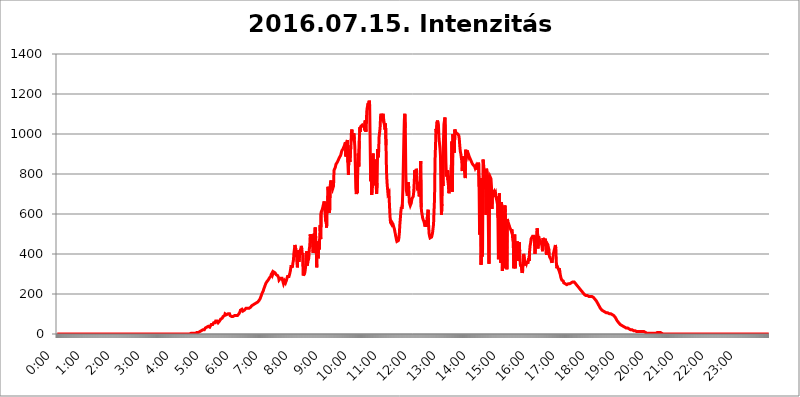
| Category | 2016.07.15. Intenzitás [W/m^2] |
|---|---|
| 0.0 | 0 |
| 0.0006944444444444445 | 0 |
| 0.001388888888888889 | 0 |
| 0.0020833333333333333 | 0 |
| 0.002777777777777778 | 0 |
| 0.003472222222222222 | 0 |
| 0.004166666666666667 | 0 |
| 0.004861111111111111 | 0 |
| 0.005555555555555556 | 0 |
| 0.0062499999999999995 | 0 |
| 0.006944444444444444 | 0 |
| 0.007638888888888889 | 0 |
| 0.008333333333333333 | 0 |
| 0.009027777777777779 | 0 |
| 0.009722222222222222 | 0 |
| 0.010416666666666666 | 0 |
| 0.011111111111111112 | 0 |
| 0.011805555555555555 | 0 |
| 0.012499999999999999 | 0 |
| 0.013194444444444444 | 0 |
| 0.013888888888888888 | 0 |
| 0.014583333333333332 | 0 |
| 0.015277777777777777 | 0 |
| 0.015972222222222224 | 0 |
| 0.016666666666666666 | 0 |
| 0.017361111111111112 | 0 |
| 0.018055555555555557 | 0 |
| 0.01875 | 0 |
| 0.019444444444444445 | 0 |
| 0.02013888888888889 | 0 |
| 0.020833333333333332 | 0 |
| 0.02152777777777778 | 0 |
| 0.022222222222222223 | 0 |
| 0.02291666666666667 | 0 |
| 0.02361111111111111 | 0 |
| 0.024305555555555556 | 0 |
| 0.024999999999999998 | 0 |
| 0.025694444444444447 | 0 |
| 0.02638888888888889 | 0 |
| 0.027083333333333334 | 0 |
| 0.027777777777777776 | 0 |
| 0.02847222222222222 | 0 |
| 0.029166666666666664 | 0 |
| 0.029861111111111113 | 0 |
| 0.030555555555555555 | 0 |
| 0.03125 | 0 |
| 0.03194444444444445 | 0 |
| 0.03263888888888889 | 0 |
| 0.03333333333333333 | 0 |
| 0.034027777777777775 | 0 |
| 0.034722222222222224 | 0 |
| 0.035416666666666666 | 0 |
| 0.036111111111111115 | 0 |
| 0.03680555555555556 | 0 |
| 0.0375 | 0 |
| 0.03819444444444444 | 0 |
| 0.03888888888888889 | 0 |
| 0.03958333333333333 | 0 |
| 0.04027777777777778 | 0 |
| 0.04097222222222222 | 0 |
| 0.041666666666666664 | 0 |
| 0.042361111111111106 | 0 |
| 0.04305555555555556 | 0 |
| 0.043750000000000004 | 0 |
| 0.044444444444444446 | 0 |
| 0.04513888888888889 | 0 |
| 0.04583333333333334 | 0 |
| 0.04652777777777778 | 0 |
| 0.04722222222222222 | 0 |
| 0.04791666666666666 | 0 |
| 0.04861111111111111 | 0 |
| 0.049305555555555554 | 0 |
| 0.049999999999999996 | 0 |
| 0.05069444444444445 | 0 |
| 0.051388888888888894 | 0 |
| 0.052083333333333336 | 0 |
| 0.05277777777777778 | 0 |
| 0.05347222222222222 | 0 |
| 0.05416666666666667 | 0 |
| 0.05486111111111111 | 0 |
| 0.05555555555555555 | 0 |
| 0.05625 | 0 |
| 0.05694444444444444 | 0 |
| 0.057638888888888885 | 0 |
| 0.05833333333333333 | 0 |
| 0.05902777777777778 | 0 |
| 0.059722222222222225 | 0 |
| 0.06041666666666667 | 0 |
| 0.061111111111111116 | 0 |
| 0.06180555555555556 | 0 |
| 0.0625 | 0 |
| 0.06319444444444444 | 0 |
| 0.06388888888888888 | 0 |
| 0.06458333333333334 | 0 |
| 0.06527777777777778 | 0 |
| 0.06597222222222222 | 0 |
| 0.06666666666666667 | 0 |
| 0.06736111111111111 | 0 |
| 0.06805555555555555 | 0 |
| 0.06874999999999999 | 0 |
| 0.06944444444444443 | 0 |
| 0.07013888888888889 | 0 |
| 0.07083333333333333 | 0 |
| 0.07152777777777779 | 0 |
| 0.07222222222222223 | 0 |
| 0.07291666666666667 | 0 |
| 0.07361111111111111 | 0 |
| 0.07430555555555556 | 0 |
| 0.075 | 0 |
| 0.07569444444444444 | 0 |
| 0.0763888888888889 | 0 |
| 0.07708333333333334 | 0 |
| 0.07777777777777778 | 0 |
| 0.07847222222222222 | 0 |
| 0.07916666666666666 | 0 |
| 0.0798611111111111 | 0 |
| 0.08055555555555556 | 0 |
| 0.08125 | 0 |
| 0.08194444444444444 | 0 |
| 0.08263888888888889 | 0 |
| 0.08333333333333333 | 0 |
| 0.08402777777777777 | 0 |
| 0.08472222222222221 | 0 |
| 0.08541666666666665 | 0 |
| 0.08611111111111112 | 0 |
| 0.08680555555555557 | 0 |
| 0.08750000000000001 | 0 |
| 0.08819444444444445 | 0 |
| 0.08888888888888889 | 0 |
| 0.08958333333333333 | 0 |
| 0.09027777777777778 | 0 |
| 0.09097222222222222 | 0 |
| 0.09166666666666667 | 0 |
| 0.09236111111111112 | 0 |
| 0.09305555555555556 | 0 |
| 0.09375 | 0 |
| 0.09444444444444444 | 0 |
| 0.09513888888888888 | 0 |
| 0.09583333333333333 | 0 |
| 0.09652777777777777 | 0 |
| 0.09722222222222222 | 0 |
| 0.09791666666666667 | 0 |
| 0.09861111111111111 | 0 |
| 0.09930555555555555 | 0 |
| 0.09999999999999999 | 0 |
| 0.10069444444444443 | 0 |
| 0.1013888888888889 | 0 |
| 0.10208333333333335 | 0 |
| 0.10277777777777779 | 0 |
| 0.10347222222222223 | 0 |
| 0.10416666666666667 | 0 |
| 0.10486111111111111 | 0 |
| 0.10555555555555556 | 0 |
| 0.10625 | 0 |
| 0.10694444444444444 | 0 |
| 0.1076388888888889 | 0 |
| 0.10833333333333334 | 0 |
| 0.10902777777777778 | 0 |
| 0.10972222222222222 | 0 |
| 0.1111111111111111 | 0 |
| 0.11180555555555556 | 0 |
| 0.11180555555555556 | 0 |
| 0.1125 | 0 |
| 0.11319444444444444 | 0 |
| 0.11388888888888889 | 0 |
| 0.11458333333333333 | 0 |
| 0.11527777777777777 | 0 |
| 0.11597222222222221 | 0 |
| 0.11666666666666665 | 0 |
| 0.1173611111111111 | 0 |
| 0.11805555555555557 | 0 |
| 0.11944444444444445 | 0 |
| 0.12013888888888889 | 0 |
| 0.12083333333333333 | 0 |
| 0.12152777777777778 | 0 |
| 0.12222222222222223 | 0 |
| 0.12291666666666667 | 0 |
| 0.12291666666666667 | 0 |
| 0.12361111111111112 | 0 |
| 0.12430555555555556 | 0 |
| 0.125 | 0 |
| 0.12569444444444444 | 0 |
| 0.12638888888888888 | 0 |
| 0.12708333333333333 | 0 |
| 0.16875 | 0 |
| 0.12847222222222224 | 0 |
| 0.12916666666666668 | 0 |
| 0.12986111111111112 | 0 |
| 0.13055555555555556 | 0 |
| 0.13125 | 0 |
| 0.13194444444444445 | 0 |
| 0.1326388888888889 | 0 |
| 0.13333333333333333 | 0 |
| 0.13402777777777777 | 0 |
| 0.13402777777777777 | 0 |
| 0.13472222222222222 | 0 |
| 0.13541666666666666 | 0 |
| 0.1361111111111111 | 0 |
| 0.13749999999999998 | 0 |
| 0.13819444444444443 | 0 |
| 0.1388888888888889 | 0 |
| 0.13958333333333334 | 0 |
| 0.14027777777777778 | 0 |
| 0.14097222222222222 | 0 |
| 0.14166666666666666 | 0 |
| 0.1423611111111111 | 0 |
| 0.14305555555555557 | 0 |
| 0.14375000000000002 | 0 |
| 0.14444444444444446 | 0 |
| 0.1451388888888889 | 0 |
| 0.1451388888888889 | 0 |
| 0.14652777777777778 | 0 |
| 0.14722222222222223 | 0 |
| 0.14791666666666667 | 0 |
| 0.1486111111111111 | 0 |
| 0.14930555555555555 | 0 |
| 0.15 | 0 |
| 0.15069444444444444 | 0 |
| 0.15138888888888888 | 0 |
| 0.15208333333333332 | 0 |
| 0.15277777777777776 | 0 |
| 0.15347222222222223 | 0 |
| 0.15416666666666667 | 0 |
| 0.15486111111111112 | 0 |
| 0.15555555555555556 | 0 |
| 0.15625 | 0 |
| 0.15694444444444444 | 0 |
| 0.15763888888888888 | 0 |
| 0.15833333333333333 | 0 |
| 0.15902777777777777 | 0 |
| 0.15972222222222224 | 0 |
| 0.16041666666666668 | 0 |
| 0.16111111111111112 | 0 |
| 0.16180555555555556 | 0 |
| 0.1625 | 0 |
| 0.16319444444444445 | 0 |
| 0.1638888888888889 | 0 |
| 0.16458333333333333 | 0 |
| 0.16527777777777777 | 0 |
| 0.16597222222222222 | 0 |
| 0.16666666666666666 | 0 |
| 0.1673611111111111 | 0 |
| 0.16805555555555554 | 0 |
| 0.16874999999999998 | 0 |
| 0.16944444444444443 | 0 |
| 0.17013888888888887 | 0 |
| 0.1708333333333333 | 0 |
| 0.17152777777777775 | 0 |
| 0.17222222222222225 | 0 |
| 0.1729166666666667 | 0 |
| 0.17361111111111113 | 0 |
| 0.17430555555555557 | 0 |
| 0.17500000000000002 | 0 |
| 0.17569444444444446 | 0 |
| 0.1763888888888889 | 0 |
| 0.17708333333333334 | 0 |
| 0.17777777777777778 | 0 |
| 0.17847222222222223 | 0 |
| 0.17916666666666667 | 0 |
| 0.1798611111111111 | 0 |
| 0.18055555555555555 | 0 |
| 0.18125 | 0 |
| 0.18194444444444444 | 0 |
| 0.1826388888888889 | 0 |
| 0.18333333333333335 | 0 |
| 0.1840277777777778 | 0 |
| 0.18472222222222223 | 0 |
| 0.18541666666666667 | 0 |
| 0.18611111111111112 | 0 |
| 0.18680555555555556 | 3.525 |
| 0.1875 | 3.525 |
| 0.18819444444444444 | 3.525 |
| 0.18888888888888888 | 3.525 |
| 0.18958333333333333 | 3.525 |
| 0.19027777777777777 | 3.525 |
| 0.1909722222222222 | 3.525 |
| 0.19166666666666665 | 3.525 |
| 0.19236111111111112 | 7.887 |
| 0.19305555555555554 | 3.525 |
| 0.19375 | 3.525 |
| 0.19444444444444445 | 3.525 |
| 0.1951388888888889 | 7.887 |
| 0.19583333333333333 | 7.887 |
| 0.19652777777777777 | 7.887 |
| 0.19722222222222222 | 7.887 |
| 0.19791666666666666 | 7.887 |
| 0.1986111111111111 | 12.257 |
| 0.19930555555555554 | 12.257 |
| 0.19999999999999998 | 12.257 |
| 0.20069444444444443 | 12.257 |
| 0.20138888888888887 | 16.636 |
| 0.2020833333333333 | 16.636 |
| 0.2027777777777778 | 16.636 |
| 0.2034722222222222 | 21.024 |
| 0.2041666666666667 | 21.024 |
| 0.20486111111111113 | 21.024 |
| 0.20555555555555557 | 21.024 |
| 0.20625000000000002 | 21.024 |
| 0.20694444444444446 | 25.419 |
| 0.2076388888888889 | 29.823 |
| 0.20833333333333334 | 29.823 |
| 0.20902777777777778 | 29.823 |
| 0.20972222222222223 | 34.234 |
| 0.21041666666666667 | 34.234 |
| 0.2111111111111111 | 34.234 |
| 0.21180555555555555 | 38.653 |
| 0.2125 | 38.653 |
| 0.21319444444444444 | 34.234 |
| 0.2138888888888889 | 34.234 |
| 0.21458333333333335 | 38.653 |
| 0.2152777777777778 | 38.653 |
| 0.21597222222222223 | 47.511 |
| 0.21666666666666667 | 47.511 |
| 0.21736111111111112 | 47.511 |
| 0.21805555555555556 | 47.511 |
| 0.21875 | 51.951 |
| 0.21944444444444444 | 56.398 |
| 0.22013888888888888 | 56.398 |
| 0.22083333333333333 | 60.85 |
| 0.22152777777777777 | 56.398 |
| 0.2222222222222222 | 65.31 |
| 0.22291666666666665 | 65.31 |
| 0.2236111111111111 | 65.31 |
| 0.22430555555555556 | 65.31 |
| 0.225 | 60.85 |
| 0.22569444444444445 | 56.398 |
| 0.2263888888888889 | 60.85 |
| 0.22708333333333333 | 60.85 |
| 0.22777777777777777 | 65.31 |
| 0.22847222222222222 | 65.31 |
| 0.22916666666666666 | 74.246 |
| 0.2298611111111111 | 74.246 |
| 0.23055555555555554 | 74.246 |
| 0.23124999999999998 | 78.722 |
| 0.23194444444444443 | 83.205 |
| 0.23263888888888887 | 87.692 |
| 0.2333333333333333 | 87.692 |
| 0.2340277777777778 | 92.184 |
| 0.2347222222222222 | 92.184 |
| 0.2354166666666667 | 101.184 |
| 0.23611111111111113 | 96.682 |
| 0.23680555555555557 | 96.682 |
| 0.23750000000000002 | 96.682 |
| 0.23819444444444446 | 96.682 |
| 0.2388888888888889 | 96.682 |
| 0.23958333333333334 | 101.184 |
| 0.24027777777777778 | 105.69 |
| 0.24097222222222223 | 101.184 |
| 0.24166666666666667 | 101.184 |
| 0.2423611111111111 | 92.184 |
| 0.24305555555555555 | 87.692 |
| 0.24375 | 87.692 |
| 0.24444444444444446 | 87.692 |
| 0.24513888888888888 | 87.692 |
| 0.24583333333333335 | 87.692 |
| 0.2465277777777778 | 87.692 |
| 0.24722222222222223 | 87.692 |
| 0.24791666666666667 | 87.692 |
| 0.24861111111111112 | 92.184 |
| 0.24930555555555556 | 92.184 |
| 0.25 | 92.184 |
| 0.25069444444444444 | 92.184 |
| 0.2513888888888889 | 92.184 |
| 0.2520833333333333 | 92.184 |
| 0.25277777777777777 | 92.184 |
| 0.2534722222222222 | 92.184 |
| 0.25416666666666665 | 92.184 |
| 0.2548611111111111 | 101.184 |
| 0.2555555555555556 | 105.69 |
| 0.25625000000000003 | 110.201 |
| 0.2569444444444445 | 119.235 |
| 0.2576388888888889 | 119.235 |
| 0.25833333333333336 | 119.235 |
| 0.2590277777777778 | 123.758 |
| 0.25972222222222224 | 119.235 |
| 0.2604166666666667 | 114.716 |
| 0.2611111111111111 | 114.716 |
| 0.26180555555555557 | 119.235 |
| 0.2625 | 119.235 |
| 0.26319444444444445 | 119.235 |
| 0.2638888888888889 | 123.758 |
| 0.26458333333333334 | 128.284 |
| 0.2652777777777778 | 128.284 |
| 0.2659722222222222 | 128.284 |
| 0.26666666666666666 | 128.284 |
| 0.2673611111111111 | 128.284 |
| 0.26805555555555555 | 128.284 |
| 0.26875 | 128.284 |
| 0.26944444444444443 | 128.284 |
| 0.2701388888888889 | 128.284 |
| 0.2708333333333333 | 132.814 |
| 0.27152777777777776 | 137.347 |
| 0.2722222222222222 | 137.347 |
| 0.27291666666666664 | 141.884 |
| 0.2736111111111111 | 146.423 |
| 0.2743055555555555 | 146.423 |
| 0.27499999999999997 | 146.423 |
| 0.27569444444444446 | 150.964 |
| 0.27638888888888885 | 150.964 |
| 0.27708333333333335 | 150.964 |
| 0.2777777777777778 | 150.964 |
| 0.27847222222222223 | 155.509 |
| 0.2791666666666667 | 155.509 |
| 0.2798611111111111 | 155.509 |
| 0.28055555555555556 | 155.509 |
| 0.28125 | 160.056 |
| 0.28194444444444444 | 164.605 |
| 0.2826388888888889 | 164.605 |
| 0.2833333333333333 | 169.156 |
| 0.28402777777777777 | 173.709 |
| 0.2847222222222222 | 178.264 |
| 0.28541666666666665 | 182.82 |
| 0.28611111111111115 | 191.937 |
| 0.28680555555555554 | 196.497 |
| 0.28750000000000003 | 205.62 |
| 0.2881944444444445 | 210.182 |
| 0.2888888888888889 | 214.746 |
| 0.28958333333333336 | 223.873 |
| 0.2902777777777778 | 228.436 |
| 0.29097222222222224 | 237.564 |
| 0.2916666666666667 | 242.127 |
| 0.2923611111111111 | 251.251 |
| 0.29305555555555557 | 255.813 |
| 0.29375 | 260.373 |
| 0.29444444444444445 | 260.373 |
| 0.2951388888888889 | 264.932 |
| 0.29583333333333334 | 269.49 |
| 0.2965277777777778 | 274.047 |
| 0.2972222222222222 | 278.603 |
| 0.29791666666666666 | 278.603 |
| 0.2986111111111111 | 283.156 |
| 0.29930555555555555 | 287.709 |
| 0.3 | 296.808 |
| 0.30069444444444443 | 301.354 |
| 0.3013888888888889 | 305.898 |
| 0.3020833333333333 | 296.808 |
| 0.30277777777777776 | 301.354 |
| 0.3034722222222222 | 310.44 |
| 0.30416666666666664 | 310.44 |
| 0.3048611111111111 | 310.44 |
| 0.3055555555555555 | 305.898 |
| 0.30624999999999997 | 305.898 |
| 0.3069444444444444 | 296.808 |
| 0.3076388888888889 | 296.808 |
| 0.30833333333333335 | 292.259 |
| 0.3090277777777778 | 292.259 |
| 0.30972222222222223 | 287.709 |
| 0.3104166666666667 | 283.156 |
| 0.3111111111111111 | 269.49 |
| 0.31180555555555556 | 269.49 |
| 0.3125 | 269.49 |
| 0.31319444444444444 | 278.603 |
| 0.3138888888888889 | 283.156 |
| 0.3145833333333333 | 283.156 |
| 0.31527777777777777 | 278.603 |
| 0.3159722222222222 | 274.047 |
| 0.31666666666666665 | 260.373 |
| 0.31736111111111115 | 251.251 |
| 0.31805555555555554 | 251.251 |
| 0.31875000000000003 | 264.932 |
| 0.3194444444444445 | 260.373 |
| 0.3201388888888889 | 255.813 |
| 0.32083333333333336 | 260.373 |
| 0.3215277777777778 | 269.49 |
| 0.32222222222222224 | 278.603 |
| 0.3229166666666667 | 287.709 |
| 0.3236111111111111 | 292.259 |
| 0.32430555555555557 | 283.156 |
| 0.325 | 287.709 |
| 0.32569444444444445 | 296.808 |
| 0.3263888888888889 | 305.898 |
| 0.32708333333333334 | 319.517 |
| 0.3277777777777778 | 337.639 |
| 0.3284722222222222 | 333.113 |
| 0.32916666666666666 | 342.162 |
| 0.3298611111111111 | 337.639 |
| 0.33055555555555555 | 355.712 |
| 0.33125 | 369.23 |
| 0.33194444444444443 | 405.108 |
| 0.3326388888888889 | 422.943 |
| 0.3333333333333333 | 445.129 |
| 0.3340277777777778 | 449.551 |
| 0.3347222222222222 | 422.943 |
| 0.3354166666666667 | 405.108 |
| 0.3361111111111111 | 360.221 |
| 0.3368055555555556 | 333.113 |
| 0.33749999999999997 | 418.492 |
| 0.33819444444444446 | 409.574 |
| 0.33888888888888885 | 360.221 |
| 0.33958333333333335 | 378.224 |
| 0.34027777777777773 | 414.035 |
| 0.34097222222222223 | 418.492 |
| 0.3416666666666666 | 427.39 |
| 0.3423611111111111 | 440.702 |
| 0.3430555555555555 | 422.943 |
| 0.34375 | 396.164 |
| 0.3444444444444445 | 405.108 |
| 0.3451388888888889 | 292.259 |
| 0.3458333333333334 | 292.259 |
| 0.34652777777777777 | 296.808 |
| 0.34722222222222227 | 305.898 |
| 0.34791666666666665 | 324.052 |
| 0.34861111111111115 | 346.682 |
| 0.34930555555555554 | 373.729 |
| 0.35000000000000003 | 414.035 |
| 0.3506944444444444 | 342.162 |
| 0.3513888888888889 | 360.221 |
| 0.3520833333333333 | 360.221 |
| 0.3527777777777778 | 378.224 |
| 0.3534722222222222 | 422.943 |
| 0.3541666666666667 | 440.702 |
| 0.3548611111111111 | 497.836 |
| 0.35555555555555557 | 467.187 |
| 0.35625 | 497.836 |
| 0.35694444444444445 | 475.972 |
| 0.3576388888888889 | 484.735 |
| 0.35833333333333334 | 480.356 |
| 0.3590277777777778 | 405.108 |
| 0.3597222222222222 | 453.968 |
| 0.36041666666666666 | 502.192 |
| 0.3611111111111111 | 440.702 |
| 0.36180555555555555 | 532.513 |
| 0.3625 | 480.356 |
| 0.36319444444444443 | 436.27 |
| 0.3638888888888889 | 333.113 |
| 0.3645833333333333 | 462.786 |
| 0.3652777777777778 | 431.833 |
| 0.3659722222222222 | 378.224 |
| 0.3666666666666667 | 445.129 |
| 0.3673611111111111 | 422.943 |
| 0.3680555555555556 | 475.972 |
| 0.36874999999999997 | 545.416 |
| 0.36944444444444446 | 475.972 |
| 0.37013888888888885 | 609.062 |
| 0.37083333333333335 | 613.252 |
| 0.37152777777777773 | 621.613 |
| 0.37222222222222223 | 629.948 |
| 0.3729166666666666 | 642.4 |
| 0.3736111111111111 | 650.667 |
| 0.3743055555555555 | 663.019 |
| 0.375 | 621.613 |
| 0.3756944444444445 | 604.864 |
| 0.3763888888888889 | 562.53 |
| 0.3770833333333334 | 575.299 |
| 0.37777777777777777 | 532.513 |
| 0.37847222222222227 | 658.909 |
| 0.37916666666666665 | 629.948 |
| 0.37986111111111115 | 735.89 |
| 0.38055555555555554 | 707.8 |
| 0.38125000000000003 | 687.544 |
| 0.3819444444444444 | 604.864 |
| 0.3826388888888889 | 727.896 |
| 0.3833333333333333 | 759.723 |
| 0.3840277777777778 | 767.62 |
| 0.3847222222222222 | 767.62 |
| 0.3854166666666667 | 731.896 |
| 0.3861111111111111 | 723.889 |
| 0.38680555555555557 | 723.889 |
| 0.3875 | 739.877 |
| 0.38819444444444445 | 818.392 |
| 0.3888888888888889 | 814.519 |
| 0.38958333333333334 | 829.981 |
| 0.3902777777777778 | 837.682 |
| 0.3909722222222222 | 849.199 |
| 0.39166666666666666 | 853.029 |
| 0.3923611111111111 | 853.029 |
| 0.39305555555555555 | 860.676 |
| 0.39375 | 864.493 |
| 0.39444444444444443 | 872.114 |
| 0.3951388888888889 | 875.918 |
| 0.3958333333333333 | 883.516 |
| 0.3965277777777778 | 887.309 |
| 0.3972222222222222 | 891.099 |
| 0.3979166666666667 | 898.668 |
| 0.3986111111111111 | 909.996 |
| 0.3993055555555556 | 917.534 |
| 0.39999999999999997 | 921.298 |
| 0.40069444444444446 | 925.06 |
| 0.40138888888888885 | 928.819 |
| 0.40208333333333335 | 936.33 |
| 0.40277777777777773 | 943.832 |
| 0.40347222222222223 | 951.327 |
| 0.4041666666666666 | 958.814 |
| 0.4048611111111111 | 887.309 |
| 0.4055555555555555 | 955.071 |
| 0.40625 | 962.555 |
| 0.4069444444444445 | 970.034 |
| 0.4076388888888889 | 856.855 |
| 0.4083333333333334 | 795.074 |
| 0.40902777777777777 | 894.885 |
| 0.40972222222222227 | 898.668 |
| 0.41041666666666665 | 860.676 |
| 0.41111111111111115 | 864.493 |
| 0.41180555555555554 | 943.832 |
| 0.41250000000000003 | 1003.65 |
| 0.4131944444444444 | 1022.323 |
| 0.4138888888888889 | 988.714 |
| 0.4145833333333333 | 981.244 |
| 0.4152777777777778 | 977.508 |
| 0.4159722222222222 | 1003.65 |
| 0.4166666666666667 | 973.772 |
| 0.4173611111111111 | 936.33 |
| 0.41805555555555557 | 841.526 |
| 0.41875 | 727.896 |
| 0.41944444444444445 | 699.717 |
| 0.4201388888888889 | 719.877 |
| 0.42083333333333334 | 703.762 |
| 0.4215277777777778 | 860.676 |
| 0.4222222222222222 | 902.447 |
| 0.42291666666666666 | 837.682 |
| 0.4236111111111111 | 966.295 |
| 0.42430555555555555 | 1033.537 |
| 0.425 | 1011.118 |
| 0.42569444444444443 | 1037.277 |
| 0.4263888888888889 | 1037.277 |
| 0.4270833333333333 | 1037.277 |
| 0.4277777777777778 | 1044.762 |
| 0.4284722222222222 | 1041.019 |
| 0.4291666666666667 | 1041.019 |
| 0.4298611111111111 | 1037.277 |
| 0.4305555555555556 | 1044.762 |
| 0.43124999999999997 | 1018.587 |
| 0.43194444444444446 | 1067.267 |
| 0.43263888888888885 | 1011.118 |
| 0.43333333333333335 | 1022.323 |
| 0.43402777777777773 | 1108.816 |
| 0.43472222222222223 | 1131.708 |
| 0.4354166666666666 | 1135.543 |
| 0.4361111111111111 | 1154.814 |
| 0.4368055555555555 | 1124.056 |
| 0.4375 | 1166.46 |
| 0.4381944444444445 | 1143.232 |
| 0.4388888888888889 | 951.327 |
| 0.4395833333333334 | 763.674 |
| 0.44027777777777777 | 887.309 |
| 0.44097222222222227 | 695.666 |
| 0.44166666666666665 | 719.877 |
| 0.44236111111111115 | 743.859 |
| 0.44305555555555554 | 902.447 |
| 0.44375000000000003 | 743.859 |
| 0.4444444444444444 | 822.26 |
| 0.4451388888888889 | 767.62 |
| 0.4458333333333333 | 814.519 |
| 0.4465277777777778 | 872.114 |
| 0.4472222222222222 | 747.834 |
| 0.4479166666666667 | 699.717 |
| 0.4486111111111111 | 755.766 |
| 0.44930555555555557 | 925.06 |
| 0.45 | 883.516 |
| 0.45069444444444445 | 902.447 |
| 0.4513888888888889 | 984.98 |
| 0.45208333333333334 | 988.714 |
| 0.4527777777777778 | 1029.798 |
| 0.4534722222222222 | 1086.097 |
| 0.45416666666666666 | 1101.226 |
| 0.4548611111111111 | 1086.097 |
| 0.45555555555555555 | 1078.555 |
| 0.45625 | 1082.324 |
| 0.45694444444444443 | 1101.226 |
| 0.4576388888888889 | 1078.555 |
| 0.4583333333333333 | 1082.324 |
| 0.4590277777777778 | 1074.789 |
| 0.4597222222222222 | 1022.323 |
| 0.4604166666666667 | 1052.255 |
| 0.4611111111111111 | 943.832 |
| 0.4618055555555556 | 810.641 |
| 0.46249999999999997 | 759.723 |
| 0.46319444444444446 | 727.896 |
| 0.46388888888888885 | 699.717 |
| 0.46458333333333335 | 703.762 |
| 0.46527777777777773 | 707.8 |
| 0.46597222222222223 | 642.4 |
| 0.4666666666666666 | 592.233 |
| 0.4673611111111111 | 558.261 |
| 0.4680555555555555 | 553.986 |
| 0.46875 | 549.704 |
| 0.4694444444444445 | 558.261 |
| 0.4701388888888889 | 558.261 |
| 0.4708333333333334 | 549.704 |
| 0.47152777777777777 | 541.121 |
| 0.47222222222222227 | 532.513 |
| 0.47291666666666665 | 523.88 |
| 0.47361111111111115 | 510.885 |
| 0.47430555555555554 | 497.836 |
| 0.47500000000000003 | 484.735 |
| 0.4756944444444444 | 471.582 |
| 0.4763888888888889 | 462.786 |
| 0.4770833333333333 | 458.38 |
| 0.4777777777777778 | 458.38 |
| 0.4784722222222222 | 467.187 |
| 0.4791666666666667 | 480.356 |
| 0.4798611111111111 | 506.542 |
| 0.48055555555555557 | 549.704 |
| 0.48125 | 579.542 |
| 0.48194444444444445 | 613.252 |
| 0.4826388888888889 | 634.105 |
| 0.48333333333333334 | 625.784 |
| 0.4840277777777778 | 646.537 |
| 0.4847222222222222 | 723.889 |
| 0.48541666666666666 | 845.365 |
| 0.4861111111111111 | 973.772 |
| 0.48680555555555555 | 1071.027 |
| 0.4875 | 1101.226 |
| 0.48819444444444443 | 1029.798 |
| 0.4888888888888889 | 802.868 |
| 0.4895833333333333 | 719.877 |
| 0.4902777777777778 | 719.877 |
| 0.4909722222222222 | 691.608 |
| 0.4916666666666667 | 711.832 |
| 0.4923611111111111 | 759.723 |
| 0.4930555555555556 | 727.896 |
| 0.49374999999999997 | 658.909 |
| 0.49444444444444446 | 650.667 |
| 0.49513888888888885 | 642.4 |
| 0.49583333333333335 | 642.4 |
| 0.49652777777777773 | 654.791 |
| 0.49722222222222223 | 671.22 |
| 0.4979166666666666 | 679.395 |
| 0.4986111111111111 | 683.473 |
| 0.4993055555555555 | 687.544 |
| 0.5 | 711.832 |
| 0.5006944444444444 | 759.723 |
| 0.5013888888888889 | 818.392 |
| 0.5020833333333333 | 763.674 |
| 0.5027777777777778 | 775.492 |
| 0.5034722222222222 | 826.123 |
| 0.5041666666666667 | 814.519 |
| 0.5048611111111111 | 735.89 |
| 0.5055555555555555 | 739.877 |
| 0.50625 | 743.859 |
| 0.5069444444444444 | 711.832 |
| 0.5076388888888889 | 687.544 |
| 0.5083333333333333 | 683.473 |
| 0.5090277777777777 | 711.832 |
| 0.5097222222222222 | 864.493 |
| 0.5104166666666666 | 634.105 |
| 0.5111111111111112 | 609.062 |
| 0.5118055555555555 | 596.45 |
| 0.5125000000000001 | 579.542 |
| 0.5131944444444444 | 579.542 |
| 0.513888888888889 | 583.779 |
| 0.5145833333333333 | 558.261 |
| 0.5152777777777778 | 562.53 |
| 0.5159722222222222 | 536.82 |
| 0.5166666666666667 | 566.793 |
| 0.517361111111111 | 562.53 |
| 0.5180555555555556 | 536.82 |
| 0.5187499999999999 | 541.121 |
| 0.5194444444444445 | 600.661 |
| 0.5201388888888888 | 621.613 |
| 0.5208333333333334 | 545.416 |
| 0.5215277777777778 | 502.192 |
| 0.5222222222222223 | 489.108 |
| 0.5229166666666667 | 480.356 |
| 0.5236111111111111 | 480.356 |
| 0.5243055555555556 | 480.356 |
| 0.525 | 484.735 |
| 0.5256944444444445 | 493.475 |
| 0.5263888888888889 | 506.542 |
| 0.5270833333333333 | 528.2 |
| 0.5277777777777778 | 549.704 |
| 0.5284722222222222 | 617.436 |
| 0.5291666666666667 | 675.311 |
| 0.5298611111111111 | 868.305 |
| 0.5305555555555556 | 943.832 |
| 0.53125 | 1026.06 |
| 0.5319444444444444 | 999.916 |
| 0.5326388888888889 | 1059.756 |
| 0.5333333333333333 | 1067.267 |
| 0.5340277777777778 | 1071.027 |
| 0.5347222222222222 | 1037.277 |
| 0.5354166666666667 | 977.508 |
| 0.5361111111111111 | 973.772 |
| 0.5368055555555555 | 928.819 |
| 0.5375 | 891.099 |
| 0.5381944444444444 | 687.544 |
| 0.5388888888888889 | 596.45 |
| 0.5395833333333333 | 650.667 |
| 0.5402777777777777 | 775.492 |
| 0.5409722222222222 | 739.877 |
| 0.5416666666666666 | 962.555 |
| 0.5423611111111112 | 1048.508 |
| 0.5430555555555555 | 1052.255 |
| 0.5437500000000001 | 1082.324 |
| 0.5444444444444444 | 992.448 |
| 0.545138888888889 | 856.855 |
| 0.5458333333333333 | 787.258 |
| 0.5465277777777778 | 798.974 |
| 0.5472222222222222 | 818.392 |
| 0.5479166666666667 | 767.62 |
| 0.548611111111111 | 743.859 |
| 0.5493055555555556 | 703.762 |
| 0.5499999999999999 | 703.762 |
| 0.5506944444444445 | 699.717 |
| 0.5513888888888888 | 767.62 |
| 0.5520833333333334 | 818.392 |
| 0.5527777777777778 | 845.365 |
| 0.5534722222222223 | 962.555 |
| 0.5541666666666667 | 711.832 |
| 0.5548611111111111 | 999.916 |
| 0.5555555555555556 | 1003.65 |
| 0.55625 | 973.772 |
| 0.5569444444444445 | 906.223 |
| 0.5576388888888889 | 1022.323 |
| 0.5583333333333333 | 1014.852 |
| 0.5590277777777778 | 1011.118 |
| 0.5597222222222222 | 1003.65 |
| 0.5604166666666667 | 1003.65 |
| 0.5611111111111111 | 1003.65 |
| 0.5618055555555556 | 999.916 |
| 0.5625 | 999.916 |
| 0.5631944444444444 | 992.448 |
| 0.5638888888888889 | 973.772 |
| 0.5645833333333333 | 940.082 |
| 0.5652777777777778 | 913.766 |
| 0.5659722222222222 | 902.447 |
| 0.5666666666666667 | 902.447 |
| 0.5673611111111111 | 864.493 |
| 0.5680555555555555 | 814.519 |
| 0.56875 | 887.309 |
| 0.5694444444444444 | 845.365 |
| 0.5701388888888889 | 833.834 |
| 0.5708333333333333 | 837.682 |
| 0.5715277777777777 | 806.757 |
| 0.5722222222222222 | 779.42 |
| 0.5729166666666666 | 921.298 |
| 0.5736111111111112 | 883.516 |
| 0.5743055555555555 | 902.447 |
| 0.5750000000000001 | 917.534 |
| 0.5756944444444444 | 898.668 |
| 0.576388888888889 | 887.309 |
| 0.5770833333333333 | 894.885 |
| 0.5777777777777778 | 887.309 |
| 0.5784722222222222 | 883.516 |
| 0.5791666666666667 | 875.918 |
| 0.579861111111111 | 872.114 |
| 0.5805555555555556 | 864.493 |
| 0.5812499999999999 | 860.676 |
| 0.5819444444444445 | 853.029 |
| 0.5826388888888888 | 853.029 |
| 0.5833333333333334 | 845.365 |
| 0.5840277777777778 | 841.526 |
| 0.5847222222222223 | 841.526 |
| 0.5854166666666667 | 837.682 |
| 0.5861111111111111 | 829.981 |
| 0.5868055555555556 | 833.834 |
| 0.5875 | 841.526 |
| 0.5881944444444445 | 833.834 |
| 0.5888888888888889 | 829.981 |
| 0.5895833333333333 | 822.26 |
| 0.5902777777777778 | 845.365 |
| 0.5909722222222222 | 856.855 |
| 0.5916666666666667 | 735.89 |
| 0.5923611111111111 | 497.836 |
| 0.5930555555555556 | 592.233 |
| 0.59375 | 779.42 |
| 0.5944444444444444 | 346.682 |
| 0.5951388888888889 | 422.943 |
| 0.5958333333333333 | 387.202 |
| 0.5965277777777778 | 422.943 |
| 0.5972222222222222 | 872.114 |
| 0.5979166666666667 | 849.199 |
| 0.5986111111111111 | 822.26 |
| 0.5993055555555555 | 806.757 |
| 0.6 | 723.889 |
| 0.6006944444444444 | 822.26 |
| 0.6013888888888889 | 596.45 |
| 0.6020833333333333 | 826.123 |
| 0.6027777777777777 | 822.26 |
| 0.6034722222222222 | 791.169 |
| 0.6041666666666666 | 687.544 |
| 0.6048611111111112 | 484.735 |
| 0.6055555555555555 | 351.198 |
| 0.6062500000000001 | 775.492 |
| 0.6069444444444444 | 787.258 |
| 0.607638888888889 | 787.258 |
| 0.6083333333333333 | 775.492 |
| 0.6090277777777778 | 735.89 |
| 0.6097222222222222 | 625.784 |
| 0.6104166666666667 | 699.717 |
| 0.611111111111111 | 699.717 |
| 0.6118055555555556 | 699.717 |
| 0.6124999999999999 | 711.832 |
| 0.6131944444444445 | 699.717 |
| 0.6138888888888888 | 699.717 |
| 0.6145833333333334 | 707.8 |
| 0.6152777777777778 | 687.544 |
| 0.6159722222222223 | 675.311 |
| 0.6166666666666667 | 675.311 |
| 0.6173611111111111 | 687.544 |
| 0.6180555555555556 | 579.542 |
| 0.61875 | 373.729 |
| 0.6194444444444445 | 471.582 |
| 0.6201388888888889 | 703.762 |
| 0.6208333333333333 | 549.704 |
| 0.6215277777777778 | 658.909 |
| 0.6222222222222222 | 355.712 |
| 0.6229166666666667 | 658.909 |
| 0.6236111111111111 | 638.256 |
| 0.6243055555555556 | 314.98 |
| 0.625 | 613.252 |
| 0.6256944444444444 | 541.121 |
| 0.6263888888888889 | 328.584 |
| 0.6270833333333333 | 328.584 |
| 0.6277777777777778 | 642.4 |
| 0.6284722222222222 | 609.062 |
| 0.6291666666666667 | 497.836 |
| 0.6298611111111111 | 566.793 |
| 0.6305555555555555 | 324.052 |
| 0.63125 | 575.299 |
| 0.6319444444444444 | 562.53 |
| 0.6326388888888889 | 558.261 |
| 0.6333333333333333 | 558.261 |
| 0.6340277777777777 | 541.121 |
| 0.6347222222222222 | 532.513 |
| 0.6354166666666666 | 536.82 |
| 0.6361111111111112 | 532.513 |
| 0.6368055555555555 | 515.223 |
| 0.6375000000000001 | 523.88 |
| 0.6381944444444444 | 502.192 |
| 0.638888888888889 | 471.582 |
| 0.6395833333333333 | 458.38 |
| 0.6402777777777778 | 328.584 |
| 0.6409722222222222 | 480.356 |
| 0.6416666666666667 | 497.836 |
| 0.642361111111111 | 328.584 |
| 0.6430555555555556 | 333.113 |
| 0.6437499999999999 | 436.27 |
| 0.6444444444444445 | 369.23 |
| 0.6451388888888888 | 462.786 |
| 0.6458333333333334 | 445.129 |
| 0.6465277777777778 | 453.968 |
| 0.6472222222222223 | 364.728 |
| 0.6479166666666667 | 458.38 |
| 0.6486111111111111 | 414.035 |
| 0.6493055555555556 | 351.198 |
| 0.65 | 337.639 |
| 0.6506944444444445 | 346.682 |
| 0.6513888888888889 | 342.162 |
| 0.6520833333333333 | 305.898 |
| 0.6527777777777778 | 314.98 |
| 0.6534722222222222 | 360.221 |
| 0.6541666666666667 | 400.638 |
| 0.6548611111111111 | 405.108 |
| 0.6555555555555556 | 364.728 |
| 0.65625 | 342.162 |
| 0.6569444444444444 | 346.682 |
| 0.6576388888888889 | 364.728 |
| 0.6583333333333333 | 355.712 |
| 0.6590277777777778 | 364.728 |
| 0.6597222222222222 | 351.198 |
| 0.6604166666666667 | 355.712 |
| 0.6611111111111111 | 378.224 |
| 0.6618055555555555 | 364.728 |
| 0.6625 | 414.035 |
| 0.6631944444444444 | 440.702 |
| 0.6638888888888889 | 453.968 |
| 0.6645833333333333 | 475.972 |
| 0.6652777777777777 | 475.972 |
| 0.6659722222222222 | 480.356 |
| 0.6666666666666666 | 489.108 |
| 0.6673611111111111 | 484.735 |
| 0.6680555555555556 | 489.108 |
| 0.6687500000000001 | 489.108 |
| 0.6694444444444444 | 484.735 |
| 0.6701388888888888 | 400.638 |
| 0.6708333333333334 | 489.108 |
| 0.6715277777777778 | 458.38 |
| 0.6722222222222222 | 484.735 |
| 0.6729166666666666 | 528.2 |
| 0.6736111111111112 | 519.555 |
| 0.6743055555555556 | 427.39 |
| 0.6749999999999999 | 489.108 |
| 0.6756944444444444 | 480.356 |
| 0.6763888888888889 | 471.582 |
| 0.6770833333333334 | 467.187 |
| 0.6777777777777777 | 462.786 |
| 0.6784722222222223 | 458.38 |
| 0.6791666666666667 | 449.551 |
| 0.6798611111111111 | 440.702 |
| 0.6805555555555555 | 414.035 |
| 0.68125 | 480.356 |
| 0.6819444444444445 | 480.356 |
| 0.6826388888888889 | 475.972 |
| 0.6833333333333332 | 462.786 |
| 0.6840277777777778 | 440.702 |
| 0.6847222222222222 | 475.972 |
| 0.6854166666666667 | 471.582 |
| 0.686111111111111 | 396.164 |
| 0.6868055555555556 | 453.968 |
| 0.6875 | 449.551 |
| 0.6881944444444444 | 445.129 |
| 0.688888888888889 | 431.833 |
| 0.6895833333333333 | 422.943 |
| 0.6902777777777778 | 387.202 |
| 0.6909722222222222 | 391.685 |
| 0.6916666666666668 | 382.715 |
| 0.6923611111111111 | 373.729 |
| 0.6930555555555555 | 364.728 |
| 0.69375 | 355.712 |
| 0.6944444444444445 | 369.23 |
| 0.6951388888888889 | 378.224 |
| 0.6958333333333333 | 400.638 |
| 0.6965277777777777 | 396.164 |
| 0.6972222222222223 | 422.943 |
| 0.6979166666666666 | 431.833 |
| 0.6986111111111111 | 445.129 |
| 0.6993055555555556 | 427.39 |
| 0.7000000000000001 | 355.712 |
| 0.7006944444444444 | 328.584 |
| 0.7013888888888888 | 337.639 |
| 0.7020833333333334 | 333.113 |
| 0.7027777777777778 | 337.639 |
| 0.7034722222222222 | 319.517 |
| 0.7041666666666666 | 328.584 |
| 0.7048611111111112 | 310.44 |
| 0.7055555555555556 | 296.808 |
| 0.7062499999999999 | 283.156 |
| 0.7069444444444444 | 278.603 |
| 0.7076388888888889 | 269.49 |
| 0.7083333333333334 | 264.932 |
| 0.7090277777777777 | 264.932 |
| 0.7097222222222223 | 264.932 |
| 0.7104166666666667 | 255.813 |
| 0.7111111111111111 | 255.813 |
| 0.7118055555555555 | 251.251 |
| 0.7125 | 251.251 |
| 0.7131944444444445 | 251.251 |
| 0.7138888888888889 | 246.689 |
| 0.7145833333333332 | 246.689 |
| 0.7152777777777778 | 246.689 |
| 0.7159722222222222 | 251.251 |
| 0.7166666666666667 | 251.251 |
| 0.717361111111111 | 251.251 |
| 0.7180555555555556 | 251.251 |
| 0.71875 | 251.251 |
| 0.7194444444444444 | 251.251 |
| 0.720138888888889 | 251.251 |
| 0.7208333333333333 | 255.813 |
| 0.7215277777777778 | 255.813 |
| 0.7222222222222222 | 260.373 |
| 0.7229166666666668 | 260.373 |
| 0.7236111111111111 | 260.373 |
| 0.7243055555555555 | 260.373 |
| 0.725 | 260.373 |
| 0.7256944444444445 | 260.373 |
| 0.7263888888888889 | 255.813 |
| 0.7270833333333333 | 251.251 |
| 0.7277777777777777 | 251.251 |
| 0.7284722222222223 | 246.689 |
| 0.7291666666666666 | 242.127 |
| 0.7298611111111111 | 242.127 |
| 0.7305555555555556 | 237.564 |
| 0.7312500000000001 | 233 |
| 0.7319444444444444 | 233 |
| 0.7326388888888888 | 228.436 |
| 0.7333333333333334 | 223.873 |
| 0.7340277777777778 | 223.873 |
| 0.7347222222222222 | 219.309 |
| 0.7354166666666666 | 214.746 |
| 0.7361111111111112 | 214.746 |
| 0.7368055555555556 | 210.182 |
| 0.7374999999999999 | 205.62 |
| 0.7381944444444444 | 201.058 |
| 0.7388888888888889 | 201.058 |
| 0.7395833333333334 | 196.497 |
| 0.7402777777777777 | 196.497 |
| 0.7409722222222223 | 196.497 |
| 0.7416666666666667 | 191.937 |
| 0.7423611111111111 | 191.937 |
| 0.7430555555555555 | 191.937 |
| 0.74375 | 191.937 |
| 0.7444444444444445 | 187.378 |
| 0.7451388888888889 | 187.378 |
| 0.7458333333333332 | 187.378 |
| 0.7465277777777778 | 187.378 |
| 0.7472222222222222 | 187.378 |
| 0.7479166666666667 | 187.378 |
| 0.748611111111111 | 187.378 |
| 0.7493055555555556 | 187.378 |
| 0.75 | 187.378 |
| 0.7506944444444444 | 187.378 |
| 0.751388888888889 | 187.378 |
| 0.7520833333333333 | 182.82 |
| 0.7527777777777778 | 182.82 |
| 0.7534722222222222 | 178.264 |
| 0.7541666666666668 | 173.709 |
| 0.7548611111111111 | 173.709 |
| 0.7555555555555555 | 169.156 |
| 0.75625 | 164.605 |
| 0.7569444444444445 | 160.056 |
| 0.7576388888888889 | 155.509 |
| 0.7583333333333333 | 150.964 |
| 0.7590277777777777 | 146.423 |
| 0.7597222222222223 | 141.884 |
| 0.7604166666666666 | 137.347 |
| 0.7611111111111111 | 132.814 |
| 0.7618055555555556 | 128.284 |
| 0.7625000000000001 | 128.284 |
| 0.7631944444444444 | 123.758 |
| 0.7638888888888888 | 119.235 |
| 0.7645833333333334 | 119.235 |
| 0.7652777777777778 | 114.716 |
| 0.7659722222222222 | 114.716 |
| 0.7666666666666666 | 110.201 |
| 0.7673611111111112 | 110.201 |
| 0.7680555555555556 | 110.201 |
| 0.7687499999999999 | 110.201 |
| 0.7694444444444444 | 105.69 |
| 0.7701388888888889 | 105.69 |
| 0.7708333333333334 | 105.69 |
| 0.7715277777777777 | 105.69 |
| 0.7722222222222223 | 105.69 |
| 0.7729166666666667 | 101.184 |
| 0.7736111111111111 | 101.184 |
| 0.7743055555555555 | 101.184 |
| 0.775 | 101.184 |
| 0.7756944444444445 | 101.184 |
| 0.7763888888888889 | 101.184 |
| 0.7770833333333332 | 101.184 |
| 0.7777777777777778 | 96.682 |
| 0.7784722222222222 | 96.682 |
| 0.7791666666666667 | 96.682 |
| 0.779861111111111 | 92.184 |
| 0.7805555555555556 | 92.184 |
| 0.78125 | 87.692 |
| 0.7819444444444444 | 87.692 |
| 0.782638888888889 | 83.205 |
| 0.7833333333333333 | 78.722 |
| 0.7840277777777778 | 74.246 |
| 0.7847222222222222 | 69.775 |
| 0.7854166666666668 | 65.31 |
| 0.7861111111111111 | 65.31 |
| 0.7868055555555555 | 60.85 |
| 0.7875 | 56.398 |
| 0.7881944444444445 | 56.398 |
| 0.7888888888888889 | 51.951 |
| 0.7895833333333333 | 47.511 |
| 0.7902777777777777 | 47.511 |
| 0.7909722222222223 | 47.511 |
| 0.7916666666666666 | 43.079 |
| 0.7923611111111111 | 43.079 |
| 0.7930555555555556 | 38.653 |
| 0.7937500000000001 | 38.653 |
| 0.7944444444444444 | 38.653 |
| 0.7951388888888888 | 34.234 |
| 0.7958333333333334 | 34.234 |
| 0.7965277777777778 | 34.234 |
| 0.7972222222222222 | 29.823 |
| 0.7979166666666666 | 29.823 |
| 0.7986111111111112 | 29.823 |
| 0.7993055555555556 | 29.823 |
| 0.7999999999999999 | 29.823 |
| 0.8006944444444444 | 25.419 |
| 0.8013888888888889 | 25.419 |
| 0.8020833333333334 | 25.419 |
| 0.8027777777777777 | 25.419 |
| 0.8034722222222223 | 25.419 |
| 0.8041666666666667 | 21.024 |
| 0.8048611111111111 | 21.024 |
| 0.8055555555555555 | 21.024 |
| 0.80625 | 21.024 |
| 0.8069444444444445 | 21.024 |
| 0.8076388888888889 | 21.024 |
| 0.8083333333333332 | 16.636 |
| 0.8090277777777778 | 16.636 |
| 0.8097222222222222 | 16.636 |
| 0.8104166666666667 | 16.636 |
| 0.811111111111111 | 12.257 |
| 0.8118055555555556 | 12.257 |
| 0.8125 | 12.257 |
| 0.8131944444444444 | 12.257 |
| 0.813888888888889 | 12.257 |
| 0.8145833333333333 | 12.257 |
| 0.8152777777777778 | 12.257 |
| 0.8159722222222222 | 12.257 |
| 0.8166666666666668 | 12.257 |
| 0.8173611111111111 | 12.257 |
| 0.8180555555555555 | 12.257 |
| 0.81875 | 12.257 |
| 0.8194444444444445 | 12.257 |
| 0.8201388888888889 | 12.257 |
| 0.8208333333333333 | 12.257 |
| 0.8215277777777777 | 12.257 |
| 0.8222222222222223 | 12.257 |
| 0.8229166666666666 | 12.257 |
| 0.8236111111111111 | 7.887 |
| 0.8243055555555556 | 7.887 |
| 0.8250000000000001 | 7.887 |
| 0.8256944444444444 | 7.887 |
| 0.8263888888888888 | 7.887 |
| 0.8270833333333334 | 3.525 |
| 0.8277777777777778 | 3.525 |
| 0.8284722222222222 | 3.525 |
| 0.8291666666666666 | 3.525 |
| 0.8298611111111112 | 3.525 |
| 0.8305555555555556 | 3.525 |
| 0.8312499999999999 | 3.525 |
| 0.8319444444444444 | 3.525 |
| 0.8326388888888889 | 3.525 |
| 0.8333333333333334 | 3.525 |
| 0.8340277777777777 | 3.525 |
| 0.8347222222222223 | 3.525 |
| 0.8354166666666667 | 3.525 |
| 0.8361111111111111 | 3.525 |
| 0.8368055555555555 | 3.525 |
| 0.8375 | 3.525 |
| 0.8381944444444445 | 3.525 |
| 0.8388888888888889 | 3.525 |
| 0.8395833333333332 | 3.525 |
| 0.8402777777777778 | 7.887 |
| 0.8409722222222222 | 7.887 |
| 0.8416666666666667 | 7.887 |
| 0.842361111111111 | 12.257 |
| 0.8430555555555556 | 12.257 |
| 0.84375 | 7.887 |
| 0.8444444444444444 | 7.887 |
| 0.845138888888889 | 7.887 |
| 0.8458333333333333 | 7.887 |
| 0.8465277777777778 | 3.525 |
| 0.8472222222222222 | 3.525 |
| 0.8479166666666668 | 3.525 |
| 0.8486111111111111 | 0 |
| 0.8493055555555555 | 0 |
| 0.85 | 0 |
| 0.8506944444444445 | 0 |
| 0.8513888888888889 | 0 |
| 0.8520833333333333 | 0 |
| 0.8527777777777777 | 0 |
| 0.8534722222222223 | 0 |
| 0.8541666666666666 | 0 |
| 0.8548611111111111 | 0 |
| 0.8555555555555556 | 0 |
| 0.8562500000000001 | 0 |
| 0.8569444444444444 | 0 |
| 0.8576388888888888 | 0 |
| 0.8583333333333334 | 0 |
| 0.8590277777777778 | 0 |
| 0.8597222222222222 | 0 |
| 0.8604166666666666 | 0 |
| 0.8611111111111112 | 0 |
| 0.8618055555555556 | 0 |
| 0.8624999999999999 | 0 |
| 0.8631944444444444 | 0 |
| 0.8638888888888889 | 0 |
| 0.8645833333333334 | 0 |
| 0.8652777777777777 | 0 |
| 0.8659722222222223 | 0 |
| 0.8666666666666667 | 0 |
| 0.8673611111111111 | 0 |
| 0.8680555555555555 | 0 |
| 0.86875 | 0 |
| 0.8694444444444445 | 0 |
| 0.8701388888888889 | 0 |
| 0.8708333333333332 | 0 |
| 0.8715277777777778 | 0 |
| 0.8722222222222222 | 0 |
| 0.8729166666666667 | 0 |
| 0.873611111111111 | 0 |
| 0.8743055555555556 | 0 |
| 0.875 | 0 |
| 0.8756944444444444 | 0 |
| 0.876388888888889 | 0 |
| 0.8770833333333333 | 0 |
| 0.8777777777777778 | 0 |
| 0.8784722222222222 | 0 |
| 0.8791666666666668 | 0 |
| 0.8798611111111111 | 0 |
| 0.8805555555555555 | 0 |
| 0.88125 | 0 |
| 0.8819444444444445 | 0 |
| 0.8826388888888889 | 0 |
| 0.8833333333333333 | 0 |
| 0.8840277777777777 | 0 |
| 0.8847222222222223 | 0 |
| 0.8854166666666666 | 0 |
| 0.8861111111111111 | 0 |
| 0.8868055555555556 | 0 |
| 0.8875000000000001 | 0 |
| 0.8881944444444444 | 0 |
| 0.8888888888888888 | 0 |
| 0.8895833333333334 | 0 |
| 0.8902777777777778 | 0 |
| 0.8909722222222222 | 0 |
| 0.8916666666666666 | 0 |
| 0.8923611111111112 | 0 |
| 0.8930555555555556 | 0 |
| 0.8937499999999999 | 0 |
| 0.8944444444444444 | 0 |
| 0.8951388888888889 | 0 |
| 0.8958333333333334 | 0 |
| 0.8965277777777777 | 0 |
| 0.8972222222222223 | 0 |
| 0.8979166666666667 | 0 |
| 0.8986111111111111 | 0 |
| 0.8993055555555555 | 0 |
| 0.9 | 0 |
| 0.9006944444444445 | 0 |
| 0.9013888888888889 | 0 |
| 0.9020833333333332 | 0 |
| 0.9027777777777778 | 0 |
| 0.9034722222222222 | 0 |
| 0.9041666666666667 | 0 |
| 0.904861111111111 | 0 |
| 0.9055555555555556 | 0 |
| 0.90625 | 0 |
| 0.9069444444444444 | 0 |
| 0.907638888888889 | 0 |
| 0.9083333333333333 | 0 |
| 0.9090277777777778 | 0 |
| 0.9097222222222222 | 0 |
| 0.9104166666666668 | 0 |
| 0.9111111111111111 | 0 |
| 0.9118055555555555 | 0 |
| 0.9125 | 0 |
| 0.9131944444444445 | 0 |
| 0.9138888888888889 | 0 |
| 0.9145833333333333 | 0 |
| 0.9152777777777777 | 0 |
| 0.9159722222222223 | 0 |
| 0.9166666666666666 | 0 |
| 0.9173611111111111 | 0 |
| 0.9180555555555556 | 0 |
| 0.9187500000000001 | 0 |
| 0.9194444444444444 | 0 |
| 0.9201388888888888 | 0 |
| 0.9208333333333334 | 0 |
| 0.9215277777777778 | 0 |
| 0.9222222222222222 | 0 |
| 0.9229166666666666 | 0 |
| 0.9236111111111112 | 0 |
| 0.9243055555555556 | 0 |
| 0.9249999999999999 | 0 |
| 0.9256944444444444 | 0 |
| 0.9263888888888889 | 0 |
| 0.9270833333333334 | 0 |
| 0.9277777777777777 | 0 |
| 0.9284722222222223 | 0 |
| 0.9291666666666667 | 0 |
| 0.9298611111111111 | 0 |
| 0.9305555555555555 | 0 |
| 0.93125 | 0 |
| 0.9319444444444445 | 0 |
| 0.9326388888888889 | 0 |
| 0.9333333333333332 | 0 |
| 0.9340277777777778 | 0 |
| 0.9347222222222222 | 0 |
| 0.9354166666666667 | 0 |
| 0.936111111111111 | 0 |
| 0.9368055555555556 | 0 |
| 0.9375 | 0 |
| 0.9381944444444444 | 0 |
| 0.938888888888889 | 0 |
| 0.9395833333333333 | 0 |
| 0.9402777777777778 | 0 |
| 0.9409722222222222 | 0 |
| 0.9416666666666668 | 0 |
| 0.9423611111111111 | 0 |
| 0.9430555555555555 | 0 |
| 0.94375 | 0 |
| 0.9444444444444445 | 0 |
| 0.9451388888888889 | 0 |
| 0.9458333333333333 | 0 |
| 0.9465277777777777 | 0 |
| 0.9472222222222223 | 0 |
| 0.9479166666666666 | 0 |
| 0.9486111111111111 | 0 |
| 0.9493055555555556 | 0 |
| 0.9500000000000001 | 0 |
| 0.9506944444444444 | 0 |
| 0.9513888888888888 | 0 |
| 0.9520833333333334 | 0 |
| 0.9527777777777778 | 0 |
| 0.9534722222222222 | 0 |
| 0.9541666666666666 | 0 |
| 0.9548611111111112 | 0 |
| 0.9555555555555556 | 0 |
| 0.9562499999999999 | 0 |
| 0.9569444444444444 | 0 |
| 0.9576388888888889 | 0 |
| 0.9583333333333334 | 0 |
| 0.9590277777777777 | 0 |
| 0.9597222222222223 | 0 |
| 0.9604166666666667 | 0 |
| 0.9611111111111111 | 0 |
| 0.9618055555555555 | 0 |
| 0.9625 | 0 |
| 0.9631944444444445 | 0 |
| 0.9638888888888889 | 0 |
| 0.9645833333333332 | 0 |
| 0.9652777777777778 | 0 |
| 0.9659722222222222 | 0 |
| 0.9666666666666667 | 0 |
| 0.967361111111111 | 0 |
| 0.9680555555555556 | 0 |
| 0.96875 | 0 |
| 0.9694444444444444 | 0 |
| 0.970138888888889 | 0 |
| 0.9708333333333333 | 0 |
| 0.9715277777777778 | 0 |
| 0.9722222222222222 | 0 |
| 0.9729166666666668 | 0 |
| 0.9736111111111111 | 0 |
| 0.9743055555555555 | 0 |
| 0.975 | 0 |
| 0.9756944444444445 | 0 |
| 0.9763888888888889 | 0 |
| 0.9770833333333333 | 0 |
| 0.9777777777777777 | 0 |
| 0.9784722222222223 | 0 |
| 0.9791666666666666 | 0 |
| 0.9798611111111111 | 0 |
| 0.9805555555555556 | 0 |
| 0.9812500000000001 | 0 |
| 0.9819444444444444 | 0 |
| 0.9826388888888888 | 0 |
| 0.9833333333333334 | 0 |
| 0.9840277777777778 | 0 |
| 0.9847222222222222 | 0 |
| 0.9854166666666666 | 0 |
| 0.9861111111111112 | 0 |
| 0.9868055555555556 | 0 |
| 0.9874999999999999 | 0 |
| 0.9881944444444444 | 0 |
| 0.9888888888888889 | 0 |
| 0.9895833333333334 | 0 |
| 0.9902777777777777 | 0 |
| 0.9909722222222223 | 0 |
| 0.9916666666666667 | 0 |
| 0.9923611111111111 | 0 |
| 0.9930555555555555 | 0 |
| 0.99375 | 0 |
| 0.9944444444444445 | 0 |
| 0.9951388888888889 | 0 |
| 0.9958333333333332 | 0 |
| 0.9965277777777778 | 0 |
| 0.9972222222222222 | 0 |
| 0.9979166666666667 | 0 |
| 0.998611111111111 | 0 |
| 0.9993055555555556 | 0 |